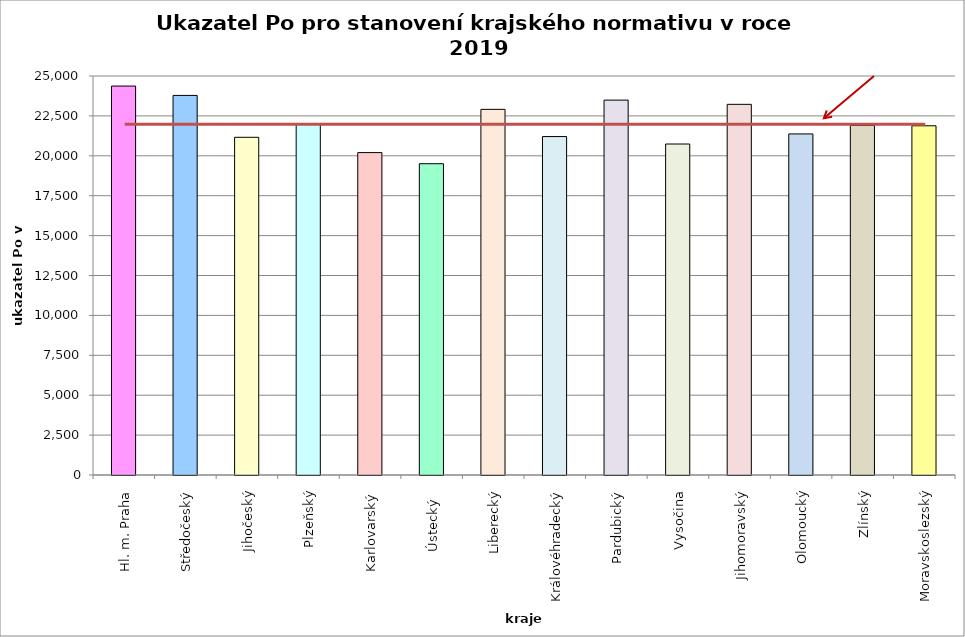
| Category | Series 0 |
|---|---|
| Hl. m. Praha | 24370 |
| Středočeský | 23784 |
| Jihočeský | 21159 |
| Plzeňský | 21960 |
| Karlovarský  | 20200 |
| Ústecký   | 19504 |
| Liberecký | 22910 |
| Královéhradecký | 21206 |
| Pardubický | 23490 |
| Vysočina | 20739 |
| Jihomoravský | 23225 |
| Olomoucký | 21371 |
| Zlínský | 21900 |
| Moravskoslezský | 21880 |